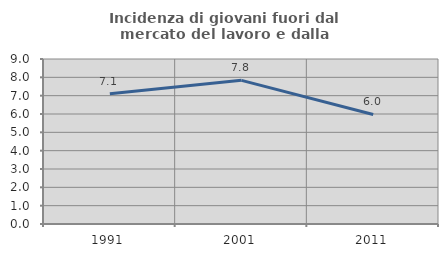
| Category | Incidenza di giovani fuori dal mercato del lavoro e dalla formazione  |
|---|---|
| 1991.0 | 7.101 |
| 2001.0 | 7.835 |
| 2011.0 | 5.976 |